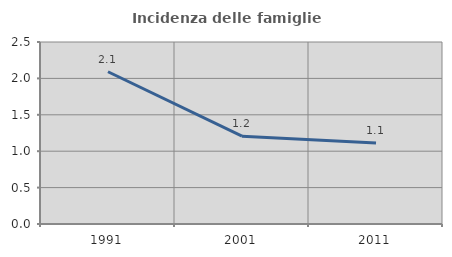
| Category | Incidenza delle famiglie numerose |
|---|---|
| 1991.0 | 2.091 |
| 2001.0 | 1.206 |
| 2011.0 | 1.114 |